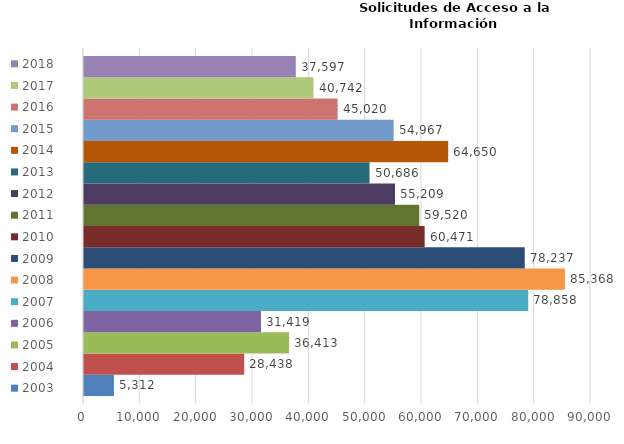
| Category | 2003 | 2004 | 2005 | 2006 | 2007 | 2008 | 2009 | 2010 | 2011 | 2012 | 2013 | 2014 | 2015 | 2016 | 2017 | 2018 |
|---|---|---|---|---|---|---|---|---|---|---|---|---|---|---|---|---|
| 0 | 5312 | 28438 | 36413 | 31419 | 78858 | 85368 | 78237 | 60471 | 59520 | 55209 | 50686 | 64650 | 54967 | 45020 | 40742 | 37597 |